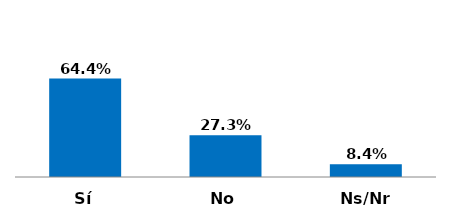
| Category | Series 0 |
|---|---|
| Sí | 0.644 |
| No | 0.273 |
| Ns/Nr | 0.084 |